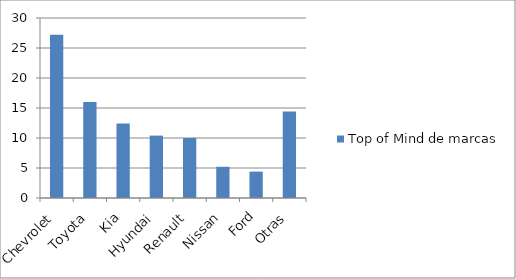
| Category | Top of Mind de marcas |
|---|---|
| Chevrolet | 27.2 |
| Toyota | 16 |
| Kia | 12.4 |
| Hyundai | 10.4 |
| Renault | 10 |
| Nissan | 5.2 |
| Ford | 4.4 |
| Otras | 14.4 |